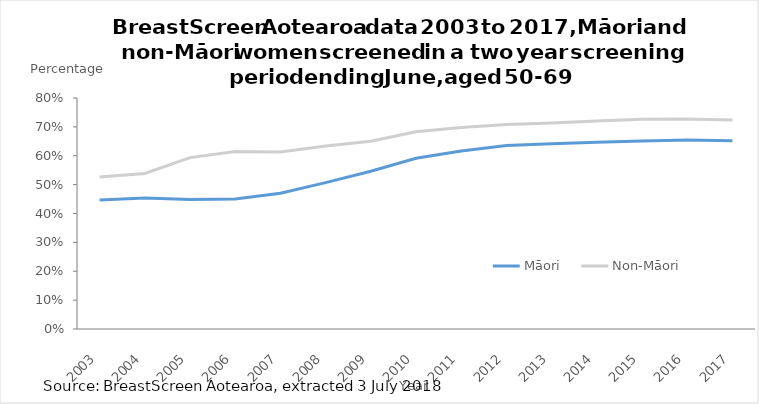
| Category | Year | Series 3 | Māori | Series 2 | Non-Māori |
|---|---|---|---|---|---|
| 2003.0 | 2003 |  | 0.447 |  | 0.526 |
| 2004.0 | 2004 |  | 0.454 |  | 0.539 |
| 2005.0 | 2005 |  | 0.448 |  | 0.594 |
| 2006.0 | 2006 |  | 0.45 |  | 0.615 |
| 2007.0 | 2007 |  | 0.47 |  | 0.613 |
| 2008.0 | 2008 |  | 0.507 |  | 0.634 |
| 2009.0 | 2009 |  | 0.547 |  | 0.65 |
| 2010.0 | 2010 |  | 0.591 |  | 0.683 |
| 2011.0 | 2011 |  | 0.617 |  | 0.697 |
| 2012.0 | 2012 |  | 0.635 |  | 0.708 |
| 2013.0 | 2013 |  | 0.642 |  | 0.713 |
| 2014.0 | 2014 |  | 0.646 |  | 0.721 |
| 2015.0 | 2015 |  | 0.651 |  | 0.726 |
| 2016.0 | 2016 |  | 0.654 |  | 0.728 |
| 2017.0 | 2017 |  | 0.652 |  | 0.724 |